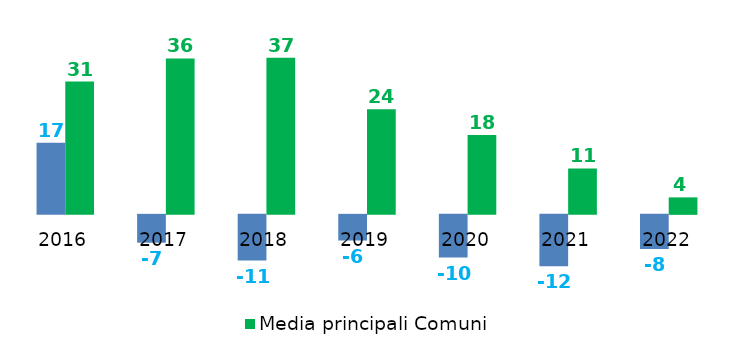
| Category | Indicatore annuale di tempestività dei pagamenti | Media principali Comuni |
|---|---|---|
| 2016.0 | 16.6 | 30.939 |
| 2017.0 | -6.51 | 36.337 |
| 2018.0 | -10.69 | 36.522 |
| 2019.0 | -6 | 24.474 |
| 2020.0 | -10 | 18.42 |
| 2021.0 | -12 | 10.619 |
| 2022.0 | -8 | 3.85 |